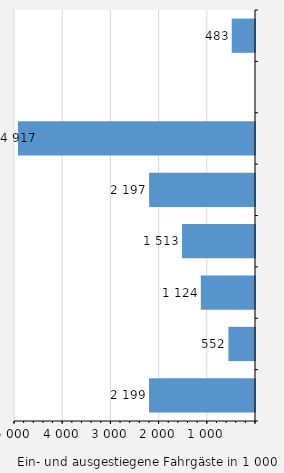
| Category | Fahrgäste |
|---|---|
| Lübeck | 483 |
| Brunsbüttel | 0 |
| Puttgarden / Fehmarn | 4917 |
| Kiel | 2197 |
| Dagebüll | 1513 |
| Föhr | 1124 |
| List / Sylt | 552 |
| Sonstige Häfen | 2199 |